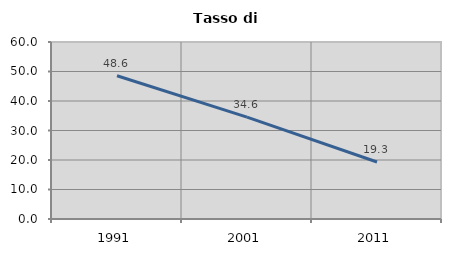
| Category | Tasso di disoccupazione   |
|---|---|
| 1991.0 | 48.562 |
| 2001.0 | 34.552 |
| 2011.0 | 19.323 |